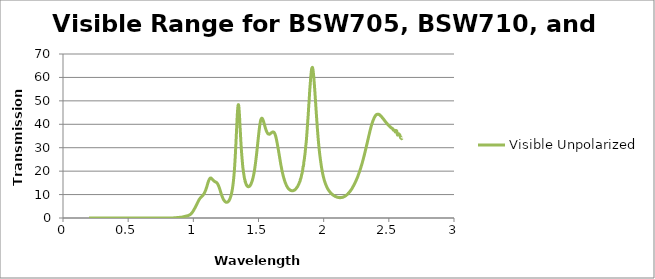
| Category | Visible Unpolarized |
|---|---|
| 2.6 | 34.013 |
| 2.599 | 33.856 |
| 2.598 | 33.845 |
| 2.597 | 33.947 |
| 2.596 | 34.112 |
| 2.595 | 34.271 |
| 2.594 | 34.298 |
| 2.593 | 34.209 |
| 2.592 | 34.2 |
| 2.591 | 34.19 |
| 2.59 | 34.294 |
| 2.589 | 34.55 |
| 2.588 | 34.658 |
| 2.587 | 34.901 |
| 2.586 | 34.983 |
| 2.585 | 35.222 |
| 2.584 | 35.471 |
| 2.583 | 35.563 |
| 2.582 | 35.593 |
| 2.581 | 35.642 |
| 2.58 | 35.603 |
| 2.579 | 35.631 |
| 2.578 | 35.732 |
| 2.577 | 35.877 |
| 2.576 | 35.919 |
| 2.575 | 35.952 |
| 2.574 | 35.89 |
| 2.573 | 35.794 |
| 2.572 | 35.579 |
| 2.571 | 35.519 |
| 2.57 | 35.51 |
| 2.569 | 35.515 |
| 2.568 | 35.427 |
| 2.567 | 35.389 |
| 2.566 | 35.509 |
| 2.565 | 35.752 |
| 2.564 | 36.041 |
| 2.563 | 36.354 |
| 2.562 | 36.685 |
| 2.561 | 36.947 |
| 2.56 | 37.202 |
| 2.559 | 37.271 |
| 2.558 | 37.256 |
| 2.557 | 37.293 |
| 2.556 | 37.348 |
| 2.555 | 37.297 |
| 2.554 | 37.2 |
| 2.553 | 37.091 |
| 2.552 | 36.963 |
| 2.551 | 36.851 |
| 2.55 | 36.791 |
| 2.549 | 36.749 |
| 2.548 | 36.877 |
| 2.547 | 36.999 |
| 2.546 | 37.054 |
| 2.545 | 37.213 |
| 2.544 | 37.394 |
| 2.543 | 37.445 |
| 2.542 | 37.495 |
| 2.541 | 37.545 |
| 2.54 | 37.578 |
| 2.539 | 37.589 |
| 2.538 | 37.508 |
| 2.537 | 37.49 |
| 2.536 | 37.508 |
| 2.535 | 37.51 |
| 2.534 | 37.591 |
| 2.533 | 37.734 |
| 2.532 | 37.81 |
| 2.531 | 37.87 |
| 2.53 | 37.92 |
| 2.529 | 38.031 |
| 2.528 | 38.173 |
| 2.527 | 38.24 |
| 2.526 | 38.301 |
| 2.525 | 38.323 |
| 2.524 | 38.364 |
| 2.523 | 38.359 |
| 2.522 | 38.406 |
| 2.521 | 38.4 |
| 2.52 | 38.395 |
| 2.519 | 38.429 |
| 2.518 | 38.526 |
| 2.517 | 38.569 |
| 2.516 | 38.602 |
| 2.515 | 38.636 |
| 2.514 | 38.68 |
| 2.513 | 38.787 |
| 2.512 | 38.91 |
| 2.511 | 38.933 |
| 2.51 | 38.922 |
| 2.509 | 38.941 |
| 2.508 | 39.011 |
| 2.507 | 39.055 |
| 2.506 | 39.085 |
| 2.505 | 39.149 |
| 2.504 | 39.259 |
| 2.503 | 39.318 |
| 2.502 | 39.349 |
| 2.501 | 39.409 |
| 2.5 | 39.512 |
| 2.499 | 39.539 |
| 2.498 | 39.551 |
| 2.497 | 39.578 |
| 2.496 | 39.652 |
| 2.495 | 39.774 |
| 2.494 | 39.827 |
| 2.493 | 39.868 |
| 2.492 | 39.916 |
| 2.491 | 39.963 |
| 2.49 | 40.009 |
| 2.489 | 40.066 |
| 2.488 | 40.146 |
| 2.487 | 40.262 |
| 2.486 | 40.308 |
| 2.485 | 40.347 |
| 2.484 | 40.408 |
| 2.483 | 40.461 |
| 2.482 | 40.536 |
| 2.481 | 40.661 |
| 2.48 | 40.718 |
| 2.479 | 40.79 |
| 2.478 | 40.904 |
| 2.477 | 40.939 |
| 2.476 | 40.974 |
| 2.475 | 41.014 |
| 2.474 | 41.076 |
| 2.473 | 41.14 |
| 2.472 | 41.208 |
| 2.471 | 41.283 |
| 2.47 | 41.376 |
| 2.469 | 41.501 |
| 2.468 | 41.561 |
| 2.467 | 41.603 |
| 2.466 | 41.644 |
| 2.465 | 41.73 |
| 2.464 | 41.846 |
| 2.463 | 41.908 |
| 2.462 | 41.992 |
| 2.461 | 42.047 |
| 2.46 | 42.086 |
| 2.459 | 42.185 |
| 2.458 | 42.302 |
| 2.457 | 42.359 |
| 2.456 | 42.402 |
| 2.455 | 42.457 |
| 2.454 | 42.52 |
| 2.453 | 42.581 |
| 2.452 | 42.658 |
| 2.451 | 42.727 |
| 2.45 | 42.789 |
| 2.449 | 42.875 |
| 2.448 | 42.993 |
| 2.447 | 43.068 |
| 2.446 | 43.127 |
| 2.445 | 43.172 |
| 2.444 | 43.222 |
| 2.443 | 43.301 |
| 2.442 | 43.399 |
| 2.441 | 43.443 |
| 2.44 | 43.491 |
| 2.439 | 43.519 |
| 2.438 | 43.549 |
| 2.437 | 43.604 |
| 2.436 | 43.658 |
| 2.435 | 43.714 |
| 2.434 | 43.805 |
| 2.433 | 43.894 |
| 2.432 | 43.932 |
| 2.431 | 43.965 |
| 2.43 | 43.994 |
| 2.429 | 44.06 |
| 2.428 | 44.13 |
| 2.427 | 44.156 |
| 2.426 | 44.172 |
| 2.425 | 44.178 |
| 2.424 | 44.187 |
| 2.423 | 44.199 |
| 2.422 | 44.241 |
| 2.421 | 44.291 |
| 2.42 | 44.297 |
| 2.419 | 44.296 |
| 2.418 | 44.299 |
| 2.417 | 44.287 |
| 2.416 | 44.279 |
| 2.415 | 44.273 |
| 2.414 | 44.257 |
| 2.413 | 44.285 |
| 2.412 | 44.306 |
| 2.411 | 44.276 |
| 2.41 | 44.238 |
| 2.409 | 44.191 |
| 2.408 | 44.153 |
| 2.407 | 44.172 |
| 2.406 | 44.182 |
| 2.405 | 44.137 |
| 2.404 | 44.081 |
| 2.403 | 44.016 |
| 2.402 | 43.952 |
| 2.401 | 43.885 |
| 2.4 | 43.813 |
| 2.399 | 43.78 |
| 2.398 | 43.752 |
| 2.397 | 43.672 |
| 2.396 | 43.575 |
| 2.395 | 43.482 |
| 2.394 | 43.39 |
| 2.393 | 43.297 |
| 2.392 | 43.196 |
| 2.391 | 43.077 |
| 2.39 | 43.002 |
| 2.389 | 42.934 |
| 2.388 | 42.824 |
| 2.387 | 42.691 |
| 2.386 | 42.548 |
| 2.385 | 42.412 |
| 2.384 | 42.278 |
| 2.383 | 42.138 |
| 2.382 | 41.99 |
| 2.381 | 41.876 |
| 2.38 | 41.764 |
| 2.379 | 41.611 |
| 2.378 | 41.446 |
| 2.377 | 41.284 |
| 2.376 | 41.122 |
| 2.375 | 40.941 |
| 2.374 | 40.769 |
| 2.373 | 40.635 |
| 2.372 | 40.49 |
| 2.371 | 40.316 |
| 2.37 | 40.135 |
| 2.369 | 39.948 |
| 2.368 | 39.752 |
| 2.367 | 39.545 |
| 2.366 | 39.354 |
| 2.365 | 39.201 |
| 2.364 | 39.019 |
| 2.363 | 38.795 |
| 2.362 | 38.58 |
| 2.361 | 38.362 |
| 2.36 | 38.128 |
| 2.359 | 37.906 |
| 2.358 | 37.68 |
| 2.357 | 37.502 |
| 2.356 | 37.304 |
| 2.355 | 37.064 |
| 2.354 | 36.828 |
| 2.353 | 36.595 |
| 2.352 | 36.355 |
| 2.351 | 36.11 |
| 2.35 | 35.864 |
| 2.349 | 35.615 |
| 2.348 | 35.407 |
| 2.347 | 35.192 |
| 2.346 | 34.952 |
| 2.345 | 34.711 |
| 2.344 | 34.468 |
| 2.343 | 34.206 |
| 2.342 | 33.956 |
| 2.341 | 33.702 |
| 2.34 | 33.494 |
| 2.339 | 33.28 |
| 2.338 | 33.032 |
| 2.337 | 32.777 |
| 2.336 | 32.541 |
| 2.335 | 32.287 |
| 2.334 | 32.041 |
| 2.333 | 31.799 |
| 2.332 | 31.603 |
| 2.331 | 31.39 |
| 2.33 | 31.147 |
| 2.329 | 30.893 |
| 2.328 | 30.654 |
| 2.327 | 30.409 |
| 2.326 | 30.156 |
| 2.325 | 29.912 |
| 2.324 | 29.713 |
| 2.323 | 29.497 |
| 2.322 | 29.255 |
| 2.321 | 29.008 |
| 2.32 | 28.761 |
| 2.319 | 28.513 |
| 2.318 | 28.273 |
| 2.317 | 28.032 |
| 2.316 | 27.845 |
| 2.315 | 27.644 |
| 2.314 | 27.406 |
| 2.313 | 27.162 |
| 2.312 | 26.935 |
| 2.311 | 26.7 |
| 2.31 | 26.471 |
| 2.309 | 26.239 |
| 2.308 | 26.058 |
| 2.307 | 25.853 |
| 2.306 | 25.632 |
| 2.305 | 25.403 |
| 2.304 | 25.184 |
| 2.303 | 24.959 |
| 2.302 | 24.742 |
| 2.301 | 24.524 |
| 2.3 | 24.367 |
| 2.299 | 24.188 |
| 2.298 | 23.971 |
| 2.297 | 23.759 |
| 2.296 | 23.553 |
| 2.295 | 23.36 |
| 2.294 | 23.16 |
| 2.293 | 22.973 |
| 2.292 | 22.765 |
| 2.291 | 22.626 |
| 2.29 | 22.461 |
| 2.289 | 22.269 |
| 2.288 | 22.072 |
| 2.287 | 21.882 |
| 2.286 | 21.681 |
| 2.285 | 21.507 |
| 2.284 | 21.325 |
| 2.283 | 21.149 |
| 2.282 | 20.962 |
| 2.281 | 20.832 |
| 2.28 | 20.674 |
| 2.279 | 20.492 |
| 2.278 | 20.315 |
| 2.277 | 20.133 |
| 2.276 | 19.959 |
| 2.275 | 19.777 |
| 2.274 | 19.604 |
| 2.273 | 19.434 |
| 2.272 | 19.273 |
| 2.271 | 19.103 |
| 2.27 | 18.994 |
| 2.269 | 18.852 |
| 2.268 | 18.7 |
| 2.267 | 18.523 |
| 2.266 | 18.36 |
| 2.265 | 18.203 |
| 2.264 | 18.043 |
| 2.263 | 17.881 |
| 2.262 | 17.745 |
| 2.261 | 17.601 |
| 2.26 | 17.447 |
| 2.259 | 17.312 |
| 2.258 | 17.166 |
| 2.257 | 17.078 |
| 2.256 | 16.964 |
| 2.255 | 16.82 |
| 2.254 | 16.686 |
| 2.253 | 16.542 |
| 2.252 | 16.406 |
| 2.251 | 16.276 |
| 2.25 | 16.14 |
| 2.249 | 16.006 |
| 2.248 | 15.88 |
| 2.247 | 15.753 |
| 2.246 | 15.672 |
| 2.245 | 15.569 |
| 2.244 | 15.431 |
| 2.243 | 15.299 |
| 2.242 | 15.172 |
| 2.241 | 15.049 |
| 2.24 | 14.917 |
| 2.239 | 14.8 |
| 2.238 | 14.728 |
| 2.237 | 14.637 |
| 2.236 | 14.498 |
| 2.235 | 14.377 |
| 2.234 | 14.269 |
| 2.233 | 14.144 |
| 2.232 | 14.022 |
| 2.231 | 13.911 |
| 2.23 | 13.796 |
| 2.229 | 13.689 |
| 2.228 | 13.642 |
| 2.227 | 13.561 |
| 2.226 | 13.435 |
| 2.225 | 13.349 |
| 2.224 | 13.246 |
| 2.223 | 13.126 |
| 2.222 | 13.022 |
| 2.221 | 12.921 |
| 2.22 | 12.817 |
| 2.219 | 12.721 |
| 2.218 | 12.637 |
| 2.217 | 12.551 |
| 2.216 | 12.457 |
| 2.215 | 12.376 |
| 2.214 | 12.285 |
| 2.213 | 12.185 |
| 2.212 | 12.096 |
| 2.211 | 12.073 |
| 2.21 | 12.008 |
| 2.209 | 11.902 |
| 2.208 | 11.804 |
| 2.207 | 11.705 |
| 2.206 | 11.667 |
| 2.205 | 11.59 |
| 2.204 | 11.485 |
| 2.203 | 11.438 |
| 2.202 | 11.364 |
| 2.201 | 11.256 |
| 2.2 | 11.218 |
| 2.199 | 11.165 |
| 2.198 | 11.079 |
| 2.197 | 10.995 |
| 2.196 | 10.924 |
| 2.195 | 10.897 |
| 2.194 | 10.826 |
| 2.193 | 10.725 |
| 2.192 | 10.691 |
| 2.191 | 10.635 |
| 2.19 | 10.602 |
| 2.189 | 10.541 |
| 2.188 | 10.448 |
| 2.187 | 10.366 |
| 2.186 | 10.297 |
| 2.185 | 10.278 |
| 2.184 | 10.229 |
| 2.183 | 10.16 |
| 2.182 | 10.098 |
| 2.181 | 10.075 |
| 2.18 | 10.017 |
| 2.179 | 9.954 |
| 2.178 | 9.89 |
| 2.177 | 9.875 |
| 2.176 | 9.832 |
| 2.175 | 9.773 |
| 2.174 | 9.72 |
| 2.173 | 9.667 |
| 2.172 | 9.654 |
| 2.171 | 9.619 |
| 2.17 | 9.562 |
| 2.169 | 9.505 |
| 2.168 | 9.468 |
| 2.167 | 9.459 |
| 2.166 | 9.421 |
| 2.165 | 9.372 |
| 2.164 | 9.331 |
| 2.163 | 9.278 |
| 2.162 | 9.245 |
| 2.161 | 9.245 |
| 2.16 | 9.227 |
| 2.159 | 9.177 |
| 2.158 | 9.137 |
| 2.157 | 9.13 |
| 2.156 | 9.108 |
| 2.155 | 9.062 |
| 2.154 | 9.017 |
| 2.153 | 8.988 |
| 2.152 | 9.004 |
| 2.151 | 8.985 |
| 2.15 | 8.936 |
| 2.149 | 8.902 |
| 2.148 | 8.877 |
| 2.147 | 8.89 |
| 2.146 | 8.87 |
| 2.145 | 8.838 |
| 2.144 | 8.82 |
| 2.143 | 8.832 |
| 2.142 | 8.816 |
| 2.141 | 8.785 |
| 2.14 | 8.766 |
| 2.139 | 8.777 |
| 2.138 | 8.765 |
| 2.137 | 8.741 |
| 2.136 | 8.721 |
| 2.135 | 8.708 |
| 2.134 | 8.73 |
| 2.133 | 8.722 |
| 2.132 | 8.705 |
| 2.131 | 8.691 |
| 2.13 | 8.715 |
| 2.129 | 8.719 |
| 2.128 | 8.703 |
| 2.127 | 8.676 |
| 2.126 | 8.678 |
| 2.125 | 8.708 |
| 2.124 | 8.714 |
| 2.123 | 8.698 |
| 2.122 | 8.683 |
| 2.121 | 8.688 |
| 2.12 | 8.726 |
| 2.119 | 8.728 |
| 2.118 | 8.715 |
| 2.117 | 8.72 |
| 2.116 | 8.756 |
| 2.115 | 8.764 |
| 2.114 | 8.75 |
| 2.113 | 8.744 |
| 2.112 | 8.755 |
| 2.111 | 8.802 |
| 2.11 | 8.809 |
| 2.109 | 8.809 |
| 2.108 | 8.811 |
| 2.107 | 8.821 |
| 2.106 | 8.872 |
| 2.105 | 8.885 |
| 2.104 | 8.887 |
| 2.103 | 8.891 |
| 2.102 | 8.896 |
| 2.101 | 8.918 |
| 2.1 | 8.975 |
| 2.099 | 8.995 |
| 2.098 | 8.998 |
| 2.097 | 9.007 |
| 2.096 | 9.037 |
| 2.095 | 9.087 |
| 2.094 | 9.106 |
| 2.093 | 9.113 |
| 2.092 | 9.122 |
| 2.091 | 9.151 |
| 2.09 | 9.208 |
| 2.089 | 9.231 |
| 2.088 | 9.251 |
| 2.087 | 9.26 |
| 2.086 | 9.301 |
| 2.085 | 9.36 |
| 2.084 | 9.383 |
| 2.083 | 9.399 |
| 2.082 | 9.424 |
| 2.081 | 9.46 |
| 2.08 | 9.512 |
| 2.079 | 9.553 |
| 2.078 | 9.57 |
| 2.077 | 9.594 |
| 2.076 | 9.623 |
| 2.075 | 9.67 |
| 2.074 | 9.737 |
| 2.073 | 9.78 |
| 2.072 | 9.811 |
| 2.071 | 9.844 |
| 2.07 | 9.901 |
| 2.069 | 9.966 |
| 2.068 | 10.01 |
| 2.067 | 10.037 |
| 2.066 | 10.061 |
| 2.065 | 10.121 |
| 2.064 | 10.202 |
| 2.063 | 10.249 |
| 2.062 | 10.284 |
| 2.061 | 10.327 |
| 2.06 | 10.365 |
| 2.059 | 10.433 |
| 2.058 | 10.511 |
| 2.057 | 10.565 |
| 2.056 | 10.608 |
| 2.055 | 10.654 |
| 2.054 | 10.728 |
| 2.053 | 10.807 |
| 2.052 | 10.86 |
| 2.051 | 10.907 |
| 2.05 | 10.954 |
| 2.049 | 11.031 |
| 2.048 | 11.119 |
| 2.047 | 11.172 |
| 2.046 | 11.226 |
| 2.045 | 11.312 |
| 2.044 | 11.409 |
| 2.043 | 11.475 |
| 2.042 | 11.531 |
| 2.041 | 11.595 |
| 2.04 | 11.686 |
| 2.039 | 11.788 |
| 2.038 | 11.865 |
| 2.037 | 11.937 |
| 2.036 | 12.037 |
| 2.035 | 12.141 |
| 2.034 | 12.223 |
| 2.033 | 12.302 |
| 2.032 | 12.383 |
| 2.031 | 12.496 |
| 2.03 | 12.618 |
| 2.029 | 12.714 |
| 2.028 | 12.808 |
| 2.027 | 12.932 |
| 2.026 | 13.062 |
| 2.025 | 13.164 |
| 2.024 | 13.268 |
| 2.023 | 13.375 |
| 2.022 | 13.512 |
| 2.021 | 13.657 |
| 2.02 | 13.778 |
| 2.019 | 13.895 |
| 2.018 | 14.016 |
| 2.017 | 14.168 |
| 2.016 | 14.323 |
| 2.015 | 14.459 |
| 2.014 | 14.593 |
| 2.013 | 14.754 |
| 2.012 | 14.918 |
| 2.011 | 15.07 |
| 2.01 | 15.218 |
| 2.009 | 15.368 |
| 2.008 | 15.553 |
| 2.007 | 15.745 |
| 2.006 | 15.924 |
| 2.005 | 16.1 |
| 2.004 | 16.28 |
| 2.003 | 16.465 |
| 2.002 | 16.691 |
| 2.001 | 16.915 |
| 2.0 | 17.115 |
| 1.999 | 17.32 |
| 1.998 | 17.542 |
| 1.997 | 17.811 |
| 1.996 | 18.07 |
| 1.995 | 18.3 |
| 1.994 | 18.535 |
| 1.993 | 18.793 |
| 1.992 | 19.053 |
| 1.991 | 19.327 |
| 1.99 | 19.655 |
| 1.989 | 19.968 |
| 1.988 | 20.264 |
| 1.987 | 20.566 |
| 1.986 | 20.878 |
| 1.985 | 21.196 |
| 1.984 | 21.523 |
| 1.983 | 21.857 |
| 1.982 | 22.22 |
| 1.981 | 22.582 |
| 1.98 | 22.958 |
| 1.979 | 23.338 |
| 1.978 | 23.725 |
| 1.977 | 24.109 |
| 1.976 | 24.509 |
| 1.975 | 24.925 |
| 1.974 | 25.357 |
| 1.973 | 25.784 |
| 1.972 | 26.199 |
| 1.971 | 26.644 |
| 1.97 | 27.133 |
| 1.969 | 27.61 |
| 1.968 | 28.095 |
| 1.967 | 28.603 |
| 1.966 | 29.145 |
| 1.965 | 29.693 |
| 1.964 | 30.247 |
| 1.963 | 30.781 |
| 1.962 | 31.344 |
| 1.961 | 31.942 |
| 1.96 | 32.562 |
| 1.959 | 33.202 |
| 1.958 | 33.844 |
| 1.957 | 34.47 |
| 1.956 | 35.175 |
| 1.955 | 35.89 |
| 1.954 | 36.586 |
| 1.953 | 37.291 |
| 1.952 | 38.023 |
| 1.951 | 38.777 |
| 1.95 | 39.52 |
| 1.949 | 40.307 |
| 1.948 | 41.1 |
| 1.947 | 41.867 |
| 1.946 | 42.696 |
| 1.945 | 43.531 |
| 1.944 | 44.328 |
| 1.943 | 45.13 |
| 1.942 | 46.013 |
| 1.941 | 46.838 |
| 1.94 | 47.681 |
| 1.939 | 48.561 |
| 1.938 | 49.416 |
| 1.937 | 50.258 |
| 1.936 | 51.067 |
| 1.935 | 51.875 |
| 1.934 | 52.731 |
| 1.933 | 53.586 |
| 1.932 | 54.4 |
| 1.931 | 55.176 |
| 1.93 | 55.944 |
| 1.929 | 56.719 |
| 1.928 | 57.46 |
| 1.927 | 58.161 |
| 1.926 | 58.868 |
| 1.925 | 59.572 |
| 1.924 | 60.196 |
| 1.923 | 60.793 |
| 1.922 | 61.377 |
| 1.921 | 61.922 |
| 1.92 | 62.44 |
| 1.919 | 62.863 |
| 1.918 | 63.276 |
| 1.917 | 63.633 |
| 1.916 | 63.898 |
| 1.915 | 64.061 |
| 1.914 | 64.257 |
| 1.913 | 64.294 |
| 1.912 | 64.199 |
| 1.911 | 64.099 |
| 1.91 | 64.001 |
| 1.909 | 63.876 |
| 1.908 | 63.775 |
| 1.907 | 63.492 |
| 1.906 | 63.016 |
| 1.905 | 62.419 |
| 1.904 | 61.827 |
| 1.903 | 61.32 |
| 1.902 | 60.805 |
| 1.901 | 60.24 |
| 1.9 | 59.593 |
| 1.899 | 58.846 |
| 1.898 | 58.019 |
| 1.897 | 57.259 |
| 1.896 | 56.541 |
| 1.895 | 55.909 |
| 1.894 | 55.158 |
| 1.893 | 54.4 |
| 1.892 | 53.464 |
| 1.891 | 52.463 |
| 1.89 | 51.5 |
| 1.889 | 50.616 |
| 1.888 | 49.769 |
| 1.887 | 49.03 |
| 1.886 | 48.284 |
| 1.885 | 47.436 |
| 1.884 | 46.464 |
| 1.883 | 45.5 |
| 1.882 | 44.591 |
| 1.881 | 43.741 |
| 1.88 | 42.969 |
| 1.879 | 42.219 |
| 1.878 | 41.505 |
| 1.877 | 40.688 |
| 1.876 | 39.835 |
| 1.875 | 38.953 |
| 1.874 | 38.185 |
| 1.873 | 37.398 |
| 1.872 | 36.547 |
| 1.871 | 35.842 |
| 1.87 | 35.12 |
| 1.869 | 34.365 |
| 1.868 | 33.582 |
| 1.867 | 32.95 |
| 1.866 | 32.364 |
| 1.865 | 31.863 |
| 1.864 | 31.378 |
| 1.863 | 30.917 |
| 1.862 | 30.402 |
| 1.861 | 29.794 |
| 1.86 | 29.157 |
| 1.859 | 28.501 |
| 1.858 | 27.962 |
| 1.857 | 27.47 |
| 1.856 | 27.043 |
| 1.855 | 26.677 |
| 1.854 | 26.228 |
| 1.853 | 25.734 |
| 1.852 | 25.219 |
| 1.851 | 24.764 |
| 1.85 | 24.491 |
| 1.849 | 24.297 |
| 1.848 | 23.911 |
| 1.847 | 23.266 |
| 1.846 | 22.617 |
| 1.845 | 22.21 |
| 1.844 | 22.074 |
| 1.843 | 21.997 |
| 1.842 | 21.894 |
| 1.841 | 21.492 |
| 1.84 | 20.902 |
| 1.839 | 20.445 |
| 1.838 | 20.118 |
| 1.837 | 19.894 |
| 1.836 | 19.606 |
| 1.835 | 19.265 |
| 1.834 | 18.979 |
| 1.833 | 18.776 |
| 1.832 | 18.672 |
| 1.831 | 18.531 |
| 1.83 | 18.268 |
| 1.829 | 17.908 |
| 1.828 | 17.635 |
| 1.827 | 17.382 |
| 1.826 | 17.147 |
| 1.825 | 16.912 |
| 1.824 | 16.759 |
| 1.823 | 16.693 |
| 1.822 | 16.645 |
| 1.821 | 16.445 |
| 1.82 | 16.069 |
| 1.819 | 15.699 |
| 1.818 | 15.532 |
| 1.817 | 15.484 |
| 1.816 | 15.433 |
| 1.815 | 15.372 |
| 1.814 | 15.198 |
| 1.813 | 15.021 |
| 1.812 | 14.854 |
| 1.811 | 14.699 |
| 1.81 | 14.54 |
| 1.809 | 14.416 |
| 1.808 | 14.343 |
| 1.807 | 14.288 |
| 1.806 | 14.192 |
| 1.805 | 14.049 |
| 1.804 | 13.89 |
| 1.803 | 13.759 |
| 1.802 | 13.651 |
| 1.801 | 13.563 |
| 1.8 | 13.46 |
| 1.799 | 13.335 |
| 1.798 | 13.244 |
| 1.797 | 13.209 |
| 1.796 | 13.189 |
| 1.795 | 13.118 |
| 1.794 | 13.007 |
| 1.793 | 12.919 |
| 1.792 | 12.829 |
| 1.791 | 12.748 |
| 1.79 | 12.677 |
| 1.789 | 12.609 |
| 1.788 | 12.545 |
| 1.787 | 12.495 |
| 1.786 | 12.439 |
| 1.785 | 12.36 |
| 1.784 | 12.308 |
| 1.783 | 12.26 |
| 1.782 | 12.194 |
| 1.781 | 12.155 |
| 1.78 | 12.112 |
| 1.779 | 12.047 |
| 1.778 | 11.975 |
| 1.777 | 11.951 |
| 1.776 | 11.929 |
| 1.775 | 11.895 |
| 1.774 | 11.859 |
| 1.773 | 11.825 |
| 1.772 | 11.798 |
| 1.771 | 11.776 |
| 1.77 | 11.752 |
| 1.769 | 11.73 |
| 1.768 | 11.711 |
| 1.767 | 11.691 |
| 1.766 | 11.678 |
| 1.765 | 11.67 |
| 1.764 | 11.647 |
| 1.763 | 11.632 |
| 1.762 | 11.62 |
| 1.761 | 11.618 |
| 1.76 | 11.608 |
| 1.759 | 11.608 |
| 1.758 | 11.605 |
| 1.757 | 11.619 |
| 1.756 | 11.636 |
| 1.755 | 11.676 |
| 1.754 | 11.69 |
| 1.753 | 11.694 |
| 1.752 | 11.701 |
| 1.751 | 11.71 |
| 1.75 | 11.726 |
| 1.749 | 11.733 |
| 1.748 | 11.748 |
| 1.747 | 11.768 |
| 1.746 | 11.799 |
| 1.745 | 11.825 |
| 1.744 | 11.853 |
| 1.743 | 11.886 |
| 1.742 | 11.919 |
| 1.741 | 11.944 |
| 1.74 | 11.984 |
| 1.739 | 12.038 |
| 1.738 | 12.124 |
| 1.737 | 12.177 |
| 1.736 | 12.21 |
| 1.735 | 12.252 |
| 1.734 | 12.302 |
| 1.733 | 12.35 |
| 1.732 | 12.402 |
| 1.731 | 12.463 |
| 1.73 | 12.524 |
| 1.729 | 12.589 |
| 1.728 | 12.649 |
| 1.727 | 12.722 |
| 1.726 | 12.791 |
| 1.725 | 12.868 |
| 1.724 | 12.945 |
| 1.723 | 13.045 |
| 1.722 | 13.167 |
| 1.721 | 13.26 |
| 1.72 | 13.339 |
| 1.719 | 13.43 |
| 1.718 | 13.519 |
| 1.717 | 13.618 |
| 1.716 | 13.73 |
| 1.715 | 13.833 |
| 1.714 | 13.948 |
| 1.713 | 14.067 |
| 1.712 | 14.193 |
| 1.711 | 14.315 |
| 1.71 | 14.467 |
| 1.709 | 14.633 |
| 1.708 | 14.772 |
| 1.707 | 14.903 |
| 1.706 | 15.033 |
| 1.705 | 15.176 |
| 1.704 | 15.334 |
| 1.703 | 15.491 |
| 1.702 | 15.65 |
| 1.701 | 15.808 |
| 1.7 | 15.968 |
| 1.699 | 16.143 |
| 1.698 | 16.338 |
| 1.697 | 16.548 |
| 1.696 | 16.738 |
| 1.695 | 16.92 |
| 1.694 | 17.102 |
| 1.693 | 17.286 |
| 1.692 | 17.484 |
| 1.691 | 17.688 |
| 1.69 | 17.893 |
| 1.689 | 18.103 |
| 1.688 | 18.35 |
| 1.687 | 18.606 |
| 1.686 | 18.824 |
| 1.685 | 19.056 |
| 1.684 | 19.294 |
| 1.683 | 19.531 |
| 1.682 | 19.774 |
| 1.681 | 20.027 |
| 1.68 | 20.302 |
| 1.679 | 20.575 |
| 1.678 | 20.869 |
| 1.677 | 21.185 |
| 1.676 | 21.474 |
| 1.675 | 21.756 |
| 1.674 | 22.047 |
| 1.673 | 22.336 |
| 1.672 | 22.63 |
| 1.671 | 22.938 |
| 1.67 | 23.245 |
| 1.669 | 23.589 |
| 1.668 | 23.938 |
| 1.667 | 24.236 |
| 1.666 | 24.546 |
| 1.665 | 24.874 |
| 1.664 | 25.206 |
| 1.663 | 25.555 |
| 1.662 | 25.897 |
| 1.661 | 26.255 |
| 1.66 | 26.618 |
| 1.659 | 26.949 |
| 1.658 | 27.272 |
| 1.657 | 27.591 |
| 1.656 | 27.912 |
| 1.655 | 28.235 |
| 1.654 | 28.558 |
| 1.653 | 28.883 |
| 1.652 | 29.202 |
| 1.651 | 29.546 |
| 1.65 | 29.886 |
| 1.649 | 30.201 |
| 1.648 | 30.513 |
| 1.647 | 30.822 |
| 1.646 | 31.124 |
| 1.645 | 31.422 |
| 1.644 | 31.748 |
| 1.643 | 32.06 |
| 1.642 | 32.335 |
| 1.641 | 32.609 |
| 1.64 | 32.876 |
| 1.639 | 33.148 |
| 1.638 | 33.438 |
| 1.637 | 33.716 |
| 1.636 | 33.962 |
| 1.635 | 34.19 |
| 1.634 | 34.413 |
| 1.633 | 34.622 |
| 1.632 | 34.852 |
| 1.631 | 35.065 |
| 1.63 | 35.24 |
| 1.629 | 35.406 |
| 1.628 | 35.559 |
| 1.627 | 35.705 |
| 1.626 | 35.846 |
| 1.625 | 35.977 |
| 1.624 | 36.096 |
| 1.623 | 36.233 |
| 1.622 | 36.355 |
| 1.621 | 36.429 |
| 1.62 | 36.492 |
| 1.619 | 36.553 |
| 1.618 | 36.611 |
| 1.617 | 36.648 |
| 1.616 | 36.675 |
| 1.615 | 36.705 |
| 1.614 | 36.731 |
| 1.613 | 36.741 |
| 1.612 | 36.742 |
| 1.611 | 36.739 |
| 1.61 | 36.728 |
| 1.609 | 36.722 |
| 1.608 | 36.703 |
| 1.607 | 36.677 |
| 1.606 | 36.645 |
| 1.605 | 36.609 |
| 1.604 | 36.568 |
| 1.603 | 36.528 |
| 1.602 | 36.488 |
| 1.601 | 36.44 |
| 1.6 | 36.398 |
| 1.599 | 36.348 |
| 1.598 | 36.328 |
| 1.597 | 36.292 |
| 1.596 | 36.235 |
| 1.595 | 36.174 |
| 1.594 | 36.128 |
| 1.593 | 36.079 |
| 1.592 | 36.018 |
| 1.591 | 35.965 |
| 1.59 | 35.924 |
| 1.589 | 35.883 |
| 1.588 | 35.852 |
| 1.587 | 35.83 |
| 1.586 | 35.808 |
| 1.585 | 35.795 |
| 1.584 | 35.764 |
| 1.583 | 35.764 |
| 1.582 | 35.779 |
| 1.581 | 35.797 |
| 1.58 | 35.802 |
| 1.579 | 35.807 |
| 1.578 | 35.814 |
| 1.577 | 35.825 |
| 1.576 | 35.856 |
| 1.575 | 35.881 |
| 1.574 | 35.936 |
| 1.573 | 36.011 |
| 1.572 | 36.059 |
| 1.571 | 36.104 |
| 1.57 | 36.156 |
| 1.569 | 36.222 |
| 1.568 | 36.332 |
| 1.567 | 36.43 |
| 1.566 | 36.509 |
| 1.565 | 36.613 |
| 1.564 | 36.721 |
| 1.563 | 36.846 |
| 1.562 | 36.975 |
| 1.561 | 37.107 |
| 1.56 | 37.234 |
| 1.559 | 37.374 |
| 1.558 | 37.511 |
| 1.557 | 37.685 |
| 1.556 | 37.868 |
| 1.555 | 38.04 |
| 1.554 | 38.207 |
| 1.553 | 38.372 |
| 1.552 | 38.549 |
| 1.551 | 38.74 |
| 1.55 | 38.951 |
| 1.549 | 39.166 |
| 1.548 | 39.365 |
| 1.547 | 39.557 |
| 1.546 | 39.754 |
| 1.545 | 39.962 |
| 1.544 | 40.155 |
| 1.543 | 40.353 |
| 1.542 | 40.543 |
| 1.541 | 40.724 |
| 1.54 | 40.922 |
| 1.539 | 41.126 |
| 1.538 | 41.317 |
| 1.537 | 41.486 |
| 1.536 | 41.628 |
| 1.535 | 41.781 |
| 1.534 | 41.921 |
| 1.533 | 42.048 |
| 1.532 | 42.165 |
| 1.531 | 42.266 |
| 1.53 | 42.36 |
| 1.529 | 42.441 |
| 1.528 | 42.488 |
| 1.527 | 42.562 |
| 1.526 | 42.6 |
| 1.525 | 42.603 |
| 1.524 | 42.564 |
| 1.523 | 42.519 |
| 1.522 | 42.451 |
| 1.521 | 42.356 |
| 1.52 | 42.233 |
| 1.519 | 42.126 |
| 1.518 | 41.964 |
| 1.517 | 41.775 |
| 1.516 | 41.538 |
| 1.515 | 41.271 |
| 1.514 | 41.002 |
| 1.513 | 40.7 |
| 1.512 | 40.386 |
| 1.511 | 40.055 |
| 1.51 | 39.693 |
| 1.509 | 39.282 |
| 1.508 | 38.869 |
| 1.507 | 38.407 |
| 1.506 | 37.966 |
| 1.505 | 37.524 |
| 1.504 | 37.037 |
| 1.503 | 36.522 |
| 1.502 | 36.026 |
| 1.501 | 35.519 |
| 1.5 | 35.005 |
| 1.499 | 34.488 |
| 1.498 | 33.991 |
| 1.497 | 33.433 |
| 1.496 | 32.9 |
| 1.495 | 32.362 |
| 1.494 | 31.841 |
| 1.493 | 31.282 |
| 1.492 | 30.777 |
| 1.491 | 30.235 |
| 1.49 | 29.724 |
| 1.489 | 29.185 |
| 1.488 | 28.673 |
| 1.487 | 28.162 |
| 1.486 | 27.659 |
| 1.485 | 27.148 |
| 1.484 | 26.661 |
| 1.483 | 26.156 |
| 1.482 | 25.721 |
| 1.481 | 25.288 |
| 1.48 | 24.829 |
| 1.479 | 24.354 |
| 1.478 | 23.91 |
| 1.477 | 23.47 |
| 1.476 | 23.043 |
| 1.475 | 22.603 |
| 1.474 | 22.185 |
| 1.473 | 21.796 |
| 1.472 | 21.453 |
| 1.471 | 21.066 |
| 1.47 | 20.642 |
| 1.469 | 20.265 |
| 1.468 | 19.925 |
| 1.467 | 19.615 |
| 1.466 | 19.334 |
| 1.465 | 19.03 |
| 1.464 | 18.728 |
| 1.463 | 18.46 |
| 1.462 | 18.21 |
| 1.461 | 17.939 |
| 1.46 | 17.67 |
| 1.459 | 17.404 |
| 1.458 | 17.154 |
| 1.457 | 16.953 |
| 1.456 | 16.768 |
| 1.455 | 16.542 |
| 1.454 | 16.335 |
| 1.453 | 16.123 |
| 1.452 | 15.94 |
| 1.451 | 15.781 |
| 1.45 | 15.615 |
| 1.449 | 15.409 |
| 1.448 | 15.249 |
| 1.447 | 15.176 |
| 1.446 | 15.057 |
| 1.445 | 14.87 |
| 1.444 | 14.701 |
| 1.443 | 14.539 |
| 1.442 | 14.415 |
| 1.441 | 14.351 |
| 1.44 | 14.26 |
| 1.439 | 14.154 |
| 1.438 | 14.056 |
| 1.437 | 13.958 |
| 1.436 | 13.866 |
| 1.435 | 13.774 |
| 1.434 | 13.719 |
| 1.433 | 13.665 |
| 1.432 | 13.616 |
| 1.431 | 13.55 |
| 1.43 | 13.481 |
| 1.429 | 13.437 |
| 1.428 | 13.459 |
| 1.427 | 13.44 |
| 1.426 | 13.398 |
| 1.425 | 13.379 |
| 1.424 | 13.395 |
| 1.423 | 13.387 |
| 1.422 | 13.369 |
| 1.421 | 13.372 |
| 1.42 | 13.417 |
| 1.419 | 13.481 |
| 1.418 | 13.436 |
| 1.417 | 13.416 |
| 1.416 | 13.452 |
| 1.415 | 13.609 |
| 1.414 | 13.716 |
| 1.413 | 13.671 |
| 1.412 | 13.677 |
| 1.411 | 13.785 |
| 1.41 | 13.985 |
| 1.409 | 14.133 |
| 1.408 | 14.142 |
| 1.407 | 14.143 |
| 1.406 | 14.238 |
| 1.405 | 14.393 |
| 1.404 | 14.54 |
| 1.403 | 14.637 |
| 1.402 | 14.863 |
| 1.401 | 15.242 |
| 1.4 | 15.461 |
| 1.399 | 15.382 |
| 1.398 | 15.381 |
| 1.397 | 15.691 |
| 1.396 | 16.203 |
| 1.395 | 16.47 |
| 1.394 | 16.483 |
| 1.393 | 16.662 |
| 1.392 | 17.014 |
| 1.391 | 17.315 |
| 1.39 | 17.626 |
| 1.389 | 18.076 |
| 1.388 | 18.492 |
| 1.387 | 18.789 |
| 1.386 | 19.061 |
| 1.385 | 19.471 |
| 1.384 | 19.942 |
| 1.383 | 20.422 |
| 1.382 | 20.82 |
| 1.381 | 21.154 |
| 1.38 | 21.559 |
| 1.379 | 22.091 |
| 1.378 | 22.733 |
| 1.377 | 23.424 |
| 1.376 | 24.07 |
| 1.375 | 24.708 |
| 1.374 | 25.301 |
| 1.373 | 25.95 |
| 1.372 | 26.676 |
| 1.371 | 27.42 |
| 1.37 | 28.122 |
| 1.369 | 28.843 |
| 1.368 | 29.668 |
| 1.367 | 30.583 |
| 1.366 | 31.43 |
| 1.365 | 32.335 |
| 1.364 | 33.384 |
| 1.363 | 34.362 |
| 1.362 | 35.375 |
| 1.361 | 36.532 |
| 1.36 | 37.49 |
| 1.359 | 38.443 |
| 1.358 | 39.555 |
| 1.357 | 40.749 |
| 1.356 | 41.862 |
| 1.355 | 42.928 |
| 1.354 | 43.86 |
| 1.353 | 44.693 |
| 1.352 | 45.514 |
| 1.351 | 46.307 |
| 1.35 | 46.997 |
| 1.349 | 47.566 |
| 1.348 | 47.993 |
| 1.347 | 48.239 |
| 1.346 | 48.361 |
| 1.345 | 48.386 |
| 1.344 | 48.274 |
| 1.343 | 47.974 |
| 1.342 | 47.516 |
| 1.341 | 46.929 |
| 1.34 | 46.243 |
| 1.339 | 45.486 |
| 1.338 | 44.634 |
| 1.337 | 43.642 |
| 1.336 | 42.612 |
| 1.335 | 41.514 |
| 1.334 | 40.382 |
| 1.333 | 39.215 |
| 1.332 | 38.011 |
| 1.331 | 36.79 |
| 1.33 | 35.616 |
| 1.329 | 34.458 |
| 1.328 | 33.27 |
| 1.327 | 32.08 |
| 1.326 | 30.928 |
| 1.325 | 29.822 |
| 1.324 | 28.74 |
| 1.323 | 27.668 |
| 1.322 | 26.65 |
| 1.321 | 25.65 |
| 1.32 | 24.683 |
| 1.319 | 23.758 |
| 1.318 | 22.862 |
| 1.317 | 21.999 |
| 1.316 | 21.204 |
| 1.315 | 20.432 |
| 1.314 | 19.694 |
| 1.313 | 18.997 |
| 1.312 | 18.323 |
| 1.311 | 17.687 |
| 1.31 | 17.099 |
| 1.309 | 16.536 |
| 1.308 | 15.989 |
| 1.307 | 15.46 |
| 1.306 | 14.963 |
| 1.305 | 14.511 |
| 1.304 | 14.081 |
| 1.303 | 13.643 |
| 1.302 | 13.227 |
| 1.301 | 12.849 |
| 1.3 | 12.488 |
| 1.299 | 12.155 |
| 1.298 | 11.86 |
| 1.297 | 11.565 |
| 1.296 | 11.273 |
| 1.295 | 10.993 |
| 1.294 | 10.723 |
| 1.293 | 10.471 |
| 1.292 | 10.231 |
| 1.291 | 10.008 |
| 1.29 | 9.8 |
| 1.289 | 9.598 |
| 1.288 | 9.407 |
| 1.287 | 9.226 |
| 1.286 | 9.049 |
| 1.285 | 8.878 |
| 1.284 | 8.695 |
| 1.283 | 8.521 |
| 1.282 | 8.376 |
| 1.281 | 8.242 |
| 1.28 | 8.118 |
| 1.279 | 8.004 |
| 1.278 | 7.896 |
| 1.277 | 7.787 |
| 1.276 | 7.655 |
| 1.275 | 7.529 |
| 1.274 | 7.438 |
| 1.273 | 7.355 |
| 1.272 | 7.275 |
| 1.271 | 7.204 |
| 1.27 | 7.138 |
| 1.269 | 7.073 |
| 1.268 | 7.03 |
| 1.267 | 7.005 |
| 1.266 | 6.952 |
| 1.265 | 6.896 |
| 1.264 | 6.846 |
| 1.263 | 6.796 |
| 1.262 | 6.782 |
| 1.261 | 6.777 |
| 1.26 | 6.754 |
| 1.259 | 6.752 |
| 1.258 | 6.759 |
| 1.257 | 6.753 |
| 1.256 | 6.729 |
| 1.255 | 6.713 |
| 1.254 | 6.713 |
| 1.253 | 6.715 |
| 1.252 | 6.726 |
| 1.251 | 6.76 |
| 1.25 | 6.795 |
| 1.249 | 6.816 |
| 1.248 | 6.84 |
| 1.247 | 6.876 |
| 1.246 | 6.921 |
| 1.245 | 6.963 |
| 1.244 | 7.004 |
| 1.243 | 7.057 |
| 1.242 | 7.114 |
| 1.241 | 7.181 |
| 1.24 | 7.243 |
| 1.239 | 7.299 |
| 1.238 | 7.361 |
| 1.237 | 7.438 |
| 1.236 | 7.518 |
| 1.235 | 7.584 |
| 1.234 | 7.653 |
| 1.233 | 7.738 |
| 1.232 | 7.836 |
| 1.231 | 7.938 |
| 1.23 | 8.044 |
| 1.229 | 8.163 |
| 1.228 | 8.281 |
| 1.227 | 8.399 |
| 1.226 | 8.514 |
| 1.225 | 8.661 |
| 1.224 | 8.804 |
| 1.223 | 8.929 |
| 1.222 | 9.058 |
| 1.221 | 9.221 |
| 1.22 | 9.375 |
| 1.219 | 9.522 |
| 1.218 | 9.666 |
| 1.217 | 9.843 |
| 1.216 | 10.018 |
| 1.215 | 10.18 |
| 1.214 | 10.333 |
| 1.213 | 10.5 |
| 1.212 | 10.668 |
| 1.211 | 10.84 |
| 1.21 | 11.021 |
| 1.209 | 11.197 |
| 1.208 | 11.374 |
| 1.207 | 11.558 |
| 1.206 | 11.744 |
| 1.205 | 11.91 |
| 1.204 | 12.071 |
| 1.203 | 12.236 |
| 1.202 | 12.413 |
| 1.201 | 12.603 |
| 1.2 | 12.763 |
| 1.199 | 12.914 |
| 1.198 | 13.087 |
| 1.197 | 13.255 |
| 1.196 | 13.396 |
| 1.195 | 13.526 |
| 1.194 | 13.669 |
| 1.193 | 13.808 |
| 1.192 | 13.939 |
| 1.191 | 14.066 |
| 1.19 | 14.185 |
| 1.189 | 14.32 |
| 1.188 | 14.438 |
| 1.187 | 14.52 |
| 1.186 | 14.596 |
| 1.185 | 14.676 |
| 1.184 | 14.763 |
| 1.183 | 14.848 |
| 1.182 | 14.927 |
| 1.181 | 14.994 |
| 1.18 | 15.048 |
| 1.179 | 15.1 |
| 1.178 | 15.153 |
| 1.177 | 15.197 |
| 1.176 | 15.226 |
| 1.175 | 15.274 |
| 1.174 | 15.3 |
| 1.173 | 15.332 |
| 1.172 | 15.367 |
| 1.171 | 15.396 |
| 1.17 | 15.427 |
| 1.169 | 15.457 |
| 1.168 | 15.493 |
| 1.167 | 15.471 |
| 1.166 | 15.483 |
| 1.165 | 15.527 |
| 1.164 | 15.577 |
| 1.163 | 15.614 |
| 1.162 | 15.656 |
| 1.161 | 15.701 |
| 1.16 | 15.746 |
| 1.159 | 15.8 |
| 1.158 | 15.851 |
| 1.157 | 15.898 |
| 1.156 | 15.956 |
| 1.155 | 16.014 |
| 1.154 | 16.068 |
| 1.153 | 16.135 |
| 1.152 | 16.202 |
| 1.151 | 16.256 |
| 1.15 | 16.29 |
| 1.149 | 16.348 |
| 1.148 | 16.405 |
| 1.147 | 16.474 |
| 1.146 | 16.542 |
| 1.145 | 16.604 |
| 1.144 | 16.631 |
| 1.143 | 16.67 |
| 1.142 | 16.72 |
| 1.141 | 16.785 |
| 1.14 | 16.829 |
| 1.139 | 16.877 |
| 1.138 | 16.919 |
| 1.137 | 16.968 |
| 1.136 | 17.016 |
| 1.135 | 17.064 |
| 1.134 | 17.042 |
| 1.133 | 16.955 |
| 1.132 | 16.905 |
| 1.131 | 16.943 |
| 1.13 | 17.017 |
| 1.129 | 17.011 |
| 1.128 | 16.977 |
| 1.127 | 16.879 |
| 1.126 | 16.808 |
| 1.125 | 16.744 |
| 1.124 | 16.615 |
| 1.123 | 16.527 |
| 1.122 | 16.429 |
| 1.121 | 16.328 |
| 1.12 | 16.203 |
| 1.119 | 16.073 |
| 1.118 | 15.937 |
| 1.117 | 15.796 |
| 1.116 | 15.639 |
| 1.115 | 15.485 |
| 1.114 | 15.317 |
| 1.113 | 15.147 |
| 1.112 | 14.97 |
| 1.111 | 14.806 |
| 1.11 | 14.614 |
| 1.109 | 14.443 |
| 1.108 | 14.26 |
| 1.107 | 14.076 |
| 1.106 | 13.884 |
| 1.105 | 13.652 |
| 1.104 | 13.454 |
| 1.103 | 13.293 |
| 1.102 | 13.123 |
| 1.101 | 12.966 |
| 1.1 | 12.791 |
| 1.099 | 12.644 |
| 1.098 | 12.485 |
| 1.097 | 12.326 |
| 1.096 | 12.173 |
| 1.095 | 11.976 |
| 1.094 | 11.826 |
| 1.093 | 11.685 |
| 1.092 | 11.551 |
| 1.091 | 11.433 |
| 1.09 | 11.301 |
| 1.089 | 11.181 |
| 1.088 | 11.035 |
| 1.087 | 10.915 |
| 1.086 | 10.809 |
| 1.085 | 10.715 |
| 1.084 | 10.562 |
| 1.083 | 10.461 |
| 1.082 | 10.373 |
| 1.081 | 10.287 |
| 1.08 | 10.208 |
| 1.079 | 10.124 |
| 1.078 | 10.051 |
| 1.077 | 9.977 |
| 1.076 | 9.85 |
| 1.075 | 9.784 |
| 1.074 | 9.712 |
| 1.073 | 9.671 |
| 1.072 | 9.604 |
| 1.071 | 9.54 |
| 1.07 | 9.492 |
| 1.069 | 9.389 |
| 1.068 | 9.331 |
| 1.067 | 9.28 |
| 1.066 | 9.237 |
| 1.065 | 9.195 |
| 1.064 | 9.148 |
| 1.063 | 9.104 |
| 1.062 | 9.055 |
| 1.061 | 8.995 |
| 1.06 | 8.908 |
| 1.059 | 8.847 |
| 1.058 | 8.804 |
| 1.057 | 8.753 |
| 1.056 | 8.711 |
| 1.055 | 8.659 |
| 1.054 | 8.591 |
| 1.053 | 8.489 |
| 1.052 | 8.423 |
| 1.051 | 8.362 |
| 1.05 | 8.297 |
| 1.049 | 8.233 |
| 1.048 | 8.157 |
| 1.047 | 8.071 |
| 1.046 | 7.954 |
| 1.045 | 7.867 |
| 1.044 | 7.778 |
| 1.043 | 7.698 |
| 1.042 | 7.609 |
| 1.041 | 7.51 |
| 1.04 | 7.377 |
| 1.039 | 7.266 |
| 1.038 | 7.172 |
| 1.037 | 7.076 |
| 1.036 | 6.959 |
| 1.035 | 6.813 |
| 1.034 | 6.704 |
| 1.033 | 6.601 |
| 1.032 | 6.505 |
| 1.031 | 6.4 |
| 1.03 | 6.28 |
| 1.029 | 6.126 |
| 1.028 | 6.007 |
| 1.027 | 5.905 |
| 1.026 | 5.81 |
| 1.025 | 5.707 |
| 1.024 | 5.588 |
| 1.023 | 5.438 |
| 1.022 | 5.328 |
| 1.021 | 5.224 |
| 1.02 | 5.129 |
| 1.019 | 5.029 |
| 1.018 | 4.918 |
| 1.017 | 4.783 |
| 1.016 | 4.682 |
| 1.015 | 4.592 |
| 1.014 | 4.503 |
| 1.013 | 4.389 |
| 1.012 | 4.251 |
| 1.011 | 4.152 |
| 1.01 | 4.062 |
| 1.009 | 3.981 |
| 1.008 | 3.875 |
| 1.007 | 3.751 |
| 1.006 | 3.655 |
| 1.005 | 3.576 |
| 1.004 | 3.475 |
| 1.003 | 3.34 |
| 1.002 | 3.254 |
| 1.001 | 3.176 |
| 1.0 | 3.1 |
| 0.999 | 3.001 |
| 0.998 | 2.88 |
| 0.997 | 2.804 |
| 0.996 | 2.73 |
| 0.995 | 2.66 |
| 0.994 | 2.577 |
| 0.993 | 2.465 |
| 0.992 | 2.396 |
| 0.991 | 2.319 |
| 0.99 | 2.222 |
| 0.989 | 2.165 |
| 0.988 | 2.113 |
| 0.987 | 2.065 |
| 0.986 | 2.002 |
| 0.985 | 1.917 |
| 0.984 | 1.86 |
| 0.983 | 1.812 |
| 0.982 | 1.723 |
| 0.981 | 1.679 |
| 0.98 | 1.652 |
| 0.979 | 1.601 |
| 0.978 | 1.532 |
| 0.977 | 1.497 |
| 0.976 | 1.473 |
| 0.975 | 1.434 |
| 0.974 | 1.379 |
| 0.973 | 1.356 |
| 0.972 | 1.338 |
| 0.971 | 1.292 |
| 0.97 | 1.263 |
| 0.969 | 1.241 |
| 0.968 | 1.2 |
| 0.967 | 1.188 |
| 0.966 | 1.169 |
| 0.965 | 1.13 |
| 0.964 | 1.119 |
| 0.963 | 1.104 |
| 0.962 | 1.067 |
| 0.961 | 1.061 |
| 0.96 | 1.043 |
| 0.959 | 0.991 |
| 0.958 | 0.955 |
| 0.957 | 0.96 |
| 0.956 | 0.973 |
| 0.955 | 0.968 |
| 0.954 | 0.925 |
| 0.953 | 0.89 |
| 0.952 | 0.899 |
| 0.951 | 0.904 |
| 0.95 | 0.882 |
| 0.949 | 0.873 |
| 0.948 | 0.843 |
| 0.947 | 0.805 |
| 0.946 | 0.801 |
| 0.945 | 0.818 |
| 0.944 | 0.801 |
| 0.943 | 0.772 |
| 0.942 | 0.767 |
| 0.941 | 0.758 |
| 0.94 | 0.743 |
| 0.939 | 0.739 |
| 0.938 | 0.715 |
| 0.937 | 0.705 |
| 0.936 | 0.7 |
| 0.935 | 0.675 |
| 0.934 | 0.654 |
| 0.933 | 0.656 |
| 0.932 | 0.644 |
| 0.931 | 0.607 |
| 0.93 | 0.582 |
| 0.929 | 0.591 |
| 0.928 | 0.596 |
| 0.927 | 0.568 |
| 0.926 | 0.537 |
| 0.925 | 0.53 |
| 0.924 | 0.533 |
| 0.923 | 0.54 |
| 0.922 | 0.522 |
| 0.921 | 0.474 |
| 0.92 | 0.451 |
| 0.919 | 0.451 |
| 0.918 | 0.442 |
| 0.917 | 0.445 |
| 0.916 | 0.44 |
| 0.915 | 0.413 |
| 0.914 | 0.396 |
| 0.913 | 0.39 |
| 0.912 | 0.373 |
| 0.911 | 0.35 |
| 0.91 | 0.352 |
| 0.909 | 0.361 |
| 0.908 | 0.343 |
| 0.907 | 0.315 |
| 0.906 | 0.315 |
| 0.905 | 0.325 |
| 0.904 | 0.307 |
| 0.903 | 0.29 |
| 0.902 | 0.302 |
| 0.901 | 0.317 |
| 0.9 | 0.3 |
| 0.899 | 0.271 |
| 0.898 | 0.249 |
| 0.897 | 0.254 |
| 0.896 | 0.279 |
| 0.895 | 0.278 |
| 0.894 | 0.262 |
| 0.893 | 0.243 |
| 0.892 | 0.223 |
| 0.891 | 0.213 |
| 0.89 | 0.233 |
| 0.889 | 0.254 |
| 0.888 | 0.255 |
| 0.887 | 0.228 |
| 0.886 | 0.197 |
| 0.885 | 0.176 |
| 0.884 | 0.183 |
| 0.883 | 0.208 |
| 0.882 | 0.21 |
| 0.881 | 0.199 |
| 0.88 | 0.183 |
| 0.879 | 0.158 |
| 0.878 | 0.16 |
| 0.877 | 0.175 |
| 0.876 | 0.165 |
| 0.875 | 0.157 |
| 0.874 | 0.164 |
| 0.873 | 0.166 |
| 0.872 | 0.139 |
| 0.871 | 0.105 |
| 0.87 | 0.087 |
| 0.869 | 0.11 |
| 0.868 | 0.139 |
| 0.867 | 0.142 |
| 0.866 | 0.124 |
| 0.865 | 0.101 |
| 0.864 | 0.081 |
| 0.863 | 0.063 |
| 0.862 | 0.06 |
| 0.861 | 0.079 |
| 0.86 | 0.079 |
| 0.859 | 0.074 |
| 0.858 | 0.073 |
| 0.857 | 0.07 |
| 0.856 | 0.068 |
| 0.855 | 0.067 |
| 0.854 | 0.065 |
| 0.853 | 0.062 |
| 0.852 | 0.058 |
| 0.851 | 0.056 |
| 0.85 | 0.056 |
| 0.849 | 0.055 |
| 0.848 | 0.055 |
| 0.847 | 0.052 |
| 0.846 | 0.05 |
| 0.845 | 0.049 |
| 0.844 | 0.048 |
| 0.843 | 0.045 |
| 0.842 | 0.046 |
| 0.841 | 0.044 |
| 0.84 | 0.041 |
| 0.839 | 0.041 |
| 0.838 | 0.039 |
| 0.837 | 0.04 |
| 0.836 | 0.04 |
| 0.835 | 0.037 |
| 0.834 | 0.035 |
| 0.833 | 0.033 |
| 0.832 | 0.033 |
| 0.831 | 0.032 |
| 0.83 | 0.032 |
| 0.829 | 0.03 |
| 0.828 | 0.029 |
| 0.827 | 0.027 |
| 0.826 | 0.027 |
| 0.825 | 0.026 |
| 0.824 | 0.027 |
| 0.823 | 0.023 |
| 0.822 | 0.021 |
| 0.821 | 0.021 |
| 0.82 | 0.02 |
| 0.819 | 0.02 |
| 0.818 | 0.02 |
| 0.817 | 0.018 |
| 0.816 | 0.016 |
| 0.815 | 0.016 |
| 0.814 | 0.014 |
| 0.813 | 0.014 |
| 0.812 | 0.015 |
| 0.811 | 0.012 |
| 0.81 | 0.011 |
| 0.809 | 0.009 |
| 0.808 | 0.01 |
| 0.807 | 0.009 |
| 0.806 | 0.01 |
| 0.805 | 0.008 |
| 0.804 | 0.01 |
| 0.803 | 0.008 |
| 0.802 | 0.008 |
| 0.801 | 0.006 |
| 0.8 | 0.007 |
| 0.799 | 0.006 |
| 0.798 | 0.007 |
| 0.797 | 0.007 |
| 0.796 | 0.006 |
| 0.795 | 0.004 |
| 0.794 | 0.006 |
| 0.793 | 0.003 |
| 0.792 | 0.004 |
| 0.791 | 0.004 |
| 0.79 | 0.005 |
| 0.789 | 0.002 |
| 0.788 | 0.001 |
| 0.787 | 0.002 |
| 0.786 | 0.004 |
| 0.785 | 0.003 |
| 0.784 | 0.003 |
| 0.783 | 0.001 |
| 0.782 | 0.002 |
| 0.781 | 0.001 |
| 0.78 | 0.002 |
| 0.779 | 0.002 |
| 0.778 | 0.002 |
| 0.777 | 0 |
| 0.776 | 0.001 |
| 0.775 | 0 |
| 0.774 | 0.001 |
| 0.773 | 0.002 |
| 0.772 | 0 |
| 0.771 | 0.001 |
| 0.77 | 0.002 |
| 0.769 | 0 |
| 0.768 | 0.001 |
| 0.767 | 0.002 |
| 0.766 | 0.001 |
| 0.765 | 0.002 |
| 0.764 | 0.001 |
| 0.763 | 0.002 |
| 0.762 | 0 |
| 0.761 | 0 |
| 0.76 | 0.001 |
| 0.759 | 0.002 |
| 0.758 | 0 |
| 0.757 | 0.001 |
| 0.756 | 0 |
| 0.755 | 0.002 |
| 0.754 | 0.003 |
| 0.753 | 0.003 |
| 0.752 | 0.002 |
| 0.751 | 0.002 |
| 0.75 | 0.001 |
| 0.749 | 0.001 |
| 0.748 | 0.003 |
| 0.747 | 0.003 |
| 0.746 | 0.003 |
| 0.745 | 0.003 |
| 0.744 | 0 |
| 0.743 | 0.001 |
| 0.742 | 0.004 |
| 0.741 | 0.003 |
| 0.74 | 0.002 |
| 0.739 | 0.003 |
| 0.738 | 0.002 |
| 0.737 | 0.001 |
| 0.736 | 0.003 |
| 0.735 | 0.005 |
| 0.734 | 0.002 |
| 0.733 | 0.004 |
| 0.732 | 0.001 |
| 0.731 | 0.001 |
| 0.73 | 0.004 |
| 0.729 | 0.004 |
| 0.728 | 0.004 |
| 0.727 | 0.003 |
| 0.726 | 0.001 |
| 0.725 | 0 |
| 0.724 | 0.003 |
| 0.723 | 0.005 |
| 0.722 | 0.001 |
| 0.721 | 0.005 |
| 0.72 | 0.001 |
| 0.719 | 0 |
| 0.718 | 0.006 |
| 0.717 | 0.006 |
| 0.716 | 0.003 |
| 0.715 | 0.004 |
| 0.714 | 0.001 |
| 0.713 | 0.001 |
| 0.712 | 0.003 |
| 0.711 | 0.005 |
| 0.71 | 0 |
| 0.709 | 0.005 |
| 0.708 | 0 |
| 0.707 | 0.001 |
| 0.706 | 0.004 |
| 0.705 | 0.005 |
| 0.704 | 0.001 |
| 0.703 | 0.005 |
| 0.702 | 0 |
| 0.701 | 0.002 |
| 0.7 | 0.004 |
| 0.699 | 0.006 |
| 0.698 | 0.001 |
| 0.697 | 0.005 |
| 0.696 | 0 |
| 0.695 | 0.002 |
| 0.694 | 0.005 |
| 0.693 | 0.006 |
| 0.692 | 0 |
| 0.691 | 0.004 |
| 0.69 | 0 |
| 0.689 | 0.005 |
| 0.688 | 0.004 |
| 0.687 | 0.004 |
| 0.686 | 0.001 |
| 0.685 | 0.004 |
| 0.684 | 0.001 |
| 0.683 | 0.001 |
| 0.682 | 0.005 |
| 0.681 | 0.004 |
| 0.68 | 0.004 |
| 0.679 | 0.004 |
| 0.678 | 0 |
| 0.677 | 0.002 |
| 0.676 | 0.004 |
| 0.675 | 0.006 |
| 0.674 | 0.001 |
| 0.673 | 0.005 |
| 0.672 | 0 |
| 0.671 | 0.001 |
| 0.67 | 0.005 |
| 0.669 | 0.005 |
| 0.668 | 0.001 |
| 0.667 | 0.004 |
| 0.666 | 0 |
| 0.665 | 0.002 |
| 0.664 | 0.004 |
| 0.663 | 0.006 |
| 0.662 | 0.001 |
| 0.661 | 0.004 |
| 0.66 | 0 |
| 0.659 | 0.002 |
| 0.658 | 0.004 |
| 0.657 | 0.004 |
| 0.656 | 0.004 |
| 0.655 | 0.004 |
| 0.654 | 0.001 |
| 0.653 | 0.002 |
| 0.652 | 0.004 |
| 0.651 | 0.005 |
| 0.65 | 0.002 |
| 0.649 | 0.005 |
| 0.648 | 0.002 |
| 0.647 | 0.003 |
| 0.646 | 0.006 |
| 0.645 | 0.005 |
| 0.644 | 0.003 |
| 0.643 | 0.005 |
| 0.642 | 0.001 |
| 0.641 | 0.002 |
| 0.64 | 0.005 |
| 0.639 | 0.005 |
| 0.638 | 0.002 |
| 0.637 | 0.004 |
| 0.636 | 0.001 |
| 0.635 | 0.002 |
| 0.634 | 0.005 |
| 0.633 | 0.005 |
| 0.632 | 0.002 |
| 0.631 | 0.005 |
| 0.63 | 0.002 |
| 0.629 | 0.002 |
| 0.628 | 0.005 |
| 0.627 | 0.004 |
| 0.626 | 0.002 |
| 0.625 | 0.004 |
| 0.624 | 0.002 |
| 0.623 | 0.002 |
| 0.622 | 0.005 |
| 0.621 | 0.004 |
| 0.62 | 0.003 |
| 0.619 | 0.004 |
| 0.618 | 0.002 |
| 0.617 | 0.003 |
| 0.616 | 0.005 |
| 0.615 | 0.004 |
| 0.614 | 0.005 |
| 0.613 | 0.004 |
| 0.612 | 0.003 |
| 0.611 | 0.002 |
| 0.61 | 0.006 |
| 0.609 | 0.004 |
| 0.608 | 0.004 |
| 0.607 | 0.004 |
| 0.606 | 0.002 |
| 0.605 | 0.003 |
| 0.604 | 0.005 |
| 0.603 | 0.004 |
| 0.602 | 0.004 |
| 0.601 | 0.004 |
| 0.6 | 0.002 |
| 0.599 | 0.002 |
| 0.598 | 0.006 |
| 0.597 | 0.004 |
| 0.596 | 0.003 |
| 0.595 | 0.004 |
| 0.594 | 0.002 |
| 0.593 | 0.003 |
| 0.592 | 0.005 |
| 0.591 | 0.004 |
| 0.59 | 0.006 |
| 0.589 | 0.005 |
| 0.588 | 0.003 |
| 0.587 | 0.003 |
| 0.586 | 0.006 |
| 0.585 | 0.004 |
| 0.584 | 0.003 |
| 0.583 | 0.005 |
| 0.582 | 0.004 |
| 0.581 | 0.003 |
| 0.58 | 0.005 |
| 0.579 | 0.004 |
| 0.578 | 0.003 |
| 0.577 | 0.004 |
| 0.576 | 0.002 |
| 0.575 | 0.003 |
| 0.574 | 0.005 |
| 0.573 | 0.004 |
| 0.572 | 0.004 |
| 0.571 | 0.004 |
| 0.57 | 0.001 |
| 0.569 | 0.003 |
| 0.568 | 0.005 |
| 0.567 | 0.004 |
| 0.566 | 0.004 |
| 0.565 | 0.004 |
| 0.564 | 0.002 |
| 0.563 | 0.004 |
| 0.562 | 0.005 |
| 0.561 | 0.005 |
| 0.56 | 0.006 |
| 0.559 | 0.004 |
| 0.558 | 0.003 |
| 0.557 | 0.003 |
| 0.556 | 0.002 |
| 0.555 | 0.004 |
| 0.554 | 0.006 |
| 0.553 | 0.005 |
| 0.552 | 0.005 |
| 0.551 | 0.003 |
| 0.55 | 0.003 |
| 0.549 | 0.005 |
| 0.548 | 0.006 |
| 0.547 | 0.005 |
| 0.546 | 0.004 |
| 0.545 | 0.004 |
| 0.544 | 0.002 |
| 0.543 | 0.004 |
| 0.542 | 0.006 |
| 0.541 | 0.005 |
| 0.54 | 0.005 |
| 0.539 | 0.004 |
| 0.538 | 0.002 |
| 0.537 | 0.004 |
| 0.536 | 0.006 |
| 0.535 | 0.005 |
| 0.534 | 0.005 |
| 0.533 | 0.004 |
| 0.532 | 0.002 |
| 0.531 | 0.004 |
| 0.53 | 0.006 |
| 0.529 | 0.004 |
| 0.528 | 0.004 |
| 0.527 | 0.004 |
| 0.526 | 0.002 |
| 0.525 | 0.004 |
| 0.524 | 0.006 |
| 0.523 | 0.004 |
| 0.522 | 0.004 |
| 0.521 | 0.004 |
| 0.52 | 0.002 |
| 0.519 | 0.004 |
| 0.518 | 0.006 |
| 0.517 | 0.004 |
| 0.516 | 0.004 |
| 0.515 | 0.004 |
| 0.514 | 0.002 |
| 0.513 | 0.004 |
| 0.512 | 0.006 |
| 0.511 | 0.004 |
| 0.51 | 0.004 |
| 0.509 | 0.004 |
| 0.508 | 0.002 |
| 0.507 | 0.004 |
| 0.506 | 0.006 |
| 0.505 | 0.004 |
| 0.504 | 0.004 |
| 0.503 | 0.004 |
| 0.502 | 0.002 |
| 0.501 | 0.004 |
| 0.5 | 0.006 |
| 0.499 | 0.004 |
| 0.498 | 0.004 |
| 0.497 | 0.003 |
| 0.496 | 0.002 |
| 0.495 | 0.004 |
| 0.494 | 0.006 |
| 0.493 | 0.004 |
| 0.492 | 0.004 |
| 0.491 | 0.003 |
| 0.49 | 0.002 |
| 0.489 | 0.004 |
| 0.488 | 0.005 |
| 0.487 | 0.003 |
| 0.486 | 0.004 |
| 0.485 | 0.003 |
| 0.484 | 0.002 |
| 0.483 | 0.004 |
| 0.482 | 0.006 |
| 0.481 | 0.003 |
| 0.48 | 0.004 |
| 0.479 | 0.004 |
| 0.478 | 0.002 |
| 0.477 | 0.004 |
| 0.476 | 0.006 |
| 0.475 | 0.003 |
| 0.474 | 0.004 |
| 0.473 | 0.004 |
| 0.472 | 0.002 |
| 0.471 | 0.005 |
| 0.47 | 0.005 |
| 0.469 | 0.004 |
| 0.468 | 0.004 |
| 0.467 | 0.004 |
| 0.466 | 0.002 |
| 0.465 | 0.005 |
| 0.464 | 0.006 |
| 0.463 | 0.004 |
| 0.462 | 0.005 |
| 0.461 | 0.004 |
| 0.46 | 0.001 |
| 0.459 | 0.005 |
| 0.458 | 0.005 |
| 0.457 | 0.003 |
| 0.456 | 0.004 |
| 0.455 | 0.003 |
| 0.454 | 0.001 |
| 0.453 | 0.004 |
| 0.452 | 0.005 |
| 0.451 | 0.004 |
| 0.45 | 0.005 |
| 0.449 | 0.004 |
| 0.448 | 0.002 |
| 0.447 | 0.005 |
| 0.446 | 0.005 |
| 0.445 | 0.003 |
| 0.444 | 0.004 |
| 0.443 | 0.004 |
| 0.442 | 0.002 |
| 0.441 | 0.004 |
| 0.44 | 0.005 |
| 0.439 | 0.003 |
| 0.438 | 0.005 |
| 0.437 | 0.003 |
| 0.436 | 0.002 |
| 0.435 | 0.005 |
| 0.434 | 0.006 |
| 0.433 | 0.003 |
| 0.432 | 0.005 |
| 0.431 | 0.003 |
| 0.43 | 0.002 |
| 0.429 | 0.005 |
| 0.428 | 0.004 |
| 0.427 | 0.002 |
| 0.426 | 0.005 |
| 0.425 | 0.002 |
| 0.424 | 0.002 |
| 0.423 | 0.004 |
| 0.422 | 0.003 |
| 0.421 | 0.004 |
| 0.42 | 0.007 |
| 0.419 | 0.002 |
| 0.418 | 0.002 |
| 0.417 | 0.004 |
| 0.416 | 0.006 |
| 0.415 | 0.002 |
| 0.414 | 0.005 |
| 0.413 | 0.002 |
| 0.412 | 0.002 |
| 0.411 | 0.003 |
| 0.41 | 0.005 |
| 0.409 | 0.002 |
| 0.408 | 0.005 |
| 0.407 | 0.002 |
| 0.406 | 0.002 |
| 0.405 | 0.004 |
| 0.404 | 0.006 |
| 0.403 | 0.003 |
| 0.402 | 0.005 |
| 0.401 | 0.002 |
| 0.4 | 0.003 |
| 0.399 | 0.005 |
| 0.398 | 0.006 |
| 0.397 | 0.003 |
| 0.396 | 0.005 |
| 0.395 | 0.002 |
| 0.394 | 0.002 |
| 0.393 | 0.004 |
| 0.392 | 0.006 |
| 0.391 | 0.006 |
| 0.39 | 0.007 |
| 0.389 | 0.002 |
| 0.388 | 0.002 |
| 0.387 | 0.004 |
| 0.386 | 0.005 |
| 0.385 | 0.002 |
| 0.384 | 0.006 |
| 0.383 | 0.002 |
| 0.382 | 0.002 |
| 0.381 | 0.004 |
| 0.38 | 0.006 |
| 0.379 | 0.006 |
| 0.378 | 0.007 |
| 0.377 | 0.002 |
| 0.376 | 0.004 |
| 0.375 | 0.001 |
| 0.374 | 0.004 |
| 0.373 | 0.001 |
| 0.372 | 0.002 |
| 0.371 | 0.004 |
| 0.37 | 0.004 |
| 0.369 | 0.003 |
| 0.368 | 0.006 |
| 0.367 | 0.001 |
| 0.366 | 0.002 |
| 0.365 | 0.003 |
| 0.364 | 0.006 |
| 0.363 | 0.003 |
| 0.362 | 0.006 |
| 0.361 | 0.002 |
| 0.36 | 0.002 |
| 0.359 | 0.005 |
| 0.358 | 0.005 |
| 0.357 | 0.004 |
| 0.356 | 0.005 |
| 0.355 | 0.002 |
| 0.354 | 0.002 |
| 0.353 | 0.005 |
| 0.352 | 0.006 |
| 0.351 | 0.006 |
| 0.35 | 0.005 |
| 0.349 | 0.001 |
| 0.348 | 0.001 |
| 0.347 | 0.005 |
| 0.346 | 0.004 |
| 0.345 | 0.002 |
| 0.344 | 0.004 |
| 0.343 | 0.002 |
| 0.342 | 0.002 |
| 0.341 | 0.004 |
| 0.34 | 0.005 |
| 0.339 | 0.004 |
| 0.338 | 0.005 |
| 0.337 | 0.002 |
| 0.336 | 0.001 |
| 0.335 | 0.006 |
| 0.334 | 0.006 |
| 0.333 | 0.002 |
| 0.332 | 0.006 |
| 0.331 | 0.002 |
| 0.33 | 0.001 |
| 0.329 | 0.006 |
| 0.328 | 0.004 |
| 0.327 | 0.003 |
| 0.326 | 0.006 |
| 0.325 | 0.002 |
| 0.324 | 0 |
| 0.323 | 0.004 |
| 0.322 | 0.005 |
| 0.321 | 0.007 |
| 0.32 | 0.002 |
| 0.319 | 0.007 |
| 0.318 | 0.006 |
| 0.317 | 0.006 |
| 0.316 | 0.007 |
| 0.315 | 0.001 |
| 0.314 | 0.005 |
| 0.313 | 0 |
| 0.312 | 0.001 |
| 0.311 | 0.004 |
| 0.31 | 0.004 |
| 0.309 | 0.004 |
| 0.308 | 0.007 |
| 0.307 | 0.001 |
| 0.306 | 0.003 |
| 0.305 | 0.004 |
| 0.304 | 0.006 |
| 0.303 | 0.003 |
| 0.302 | 0.005 |
| 0.301 | 0.001 |
| 0.3 | 0.002 |
| 0.299 | 0.005 |
| 0.298 | 0.005 |
| 0.297 | 0.001 |
| 0.296 | 0.005 |
| 0.295 | 0 |
| 0.294 | 0.003 |
| 0.293 | 0.005 |
| 0.292 | 0.006 |
| 0.291 | 0.004 |
| 0.29 | 0.003 |
| 0.289 | 0.002 |
| 0.288 | 0.002 |
| 0.287 | 0.006 |
| 0.286 | 0.005 |
| 0.285 | 0.004 |
| 0.284 | 0.005 |
| 0.283 | 0 |
| 0.282 | 0.003 |
| 0.281 | 0.006 |
| 0.28 | 0.005 |
| 0.279 | 0.002 |
| 0.278 | 0.005 |
| 0.277 | 0.002 |
| 0.276 | 0.002 |
| 0.275 | 0.006 |
| 0.274 | 0.005 |
| 0.273 | 0.002 |
| 0.272 | 0.005 |
| 0.271 | 0.002 |
| 0.27 | 0.002 |
| 0.269 | 0.008 |
| 0.268 | 0.005 |
| 0.267 | 0.006 |
| 0.266 | 0.005 |
| 0.265 | 0.003 |
| 0.264 | 0.003 |
| 0.263 | 0.007 |
| 0.262 | 0.003 |
| 0.261 | 0.006 |
| 0.26 | 0.006 |
| 0.259 | 0.002 |
| 0.258 | 0.002 |
| 0.257 | 0.007 |
| 0.256 | 0.005 |
| 0.255 | 0.006 |
| 0.254 | 0.006 |
| 0.253 | 0.003 |
| 0.252 | 0.003 |
| 0.251 | 0.008 |
| 0.25 | 0.006 |
| 0.249 | 0.006 |
| 0.248 | 0.004 |
| 0.247 | 0.003 |
| 0.246 | 0.002 |
| 0.245 | 0.007 |
| 0.244 | 0.006 |
| 0.243 | 0.007 |
| 0.242 | 0.004 |
| 0.241 | 0.003 |
| 0.24 | 0.004 |
| 0.239 | 0.008 |
| 0.238 | 0.004 |
| 0.237 | 0.006 |
| 0.236 | 0.005 |
| 0.235 | 0.002 |
| 0.234 | 0.003 |
| 0.233 | 0.007 |
| 0.232 | 0.005 |
| 0.231 | 0.004 |
| 0.23 | 0.005 |
| 0.229 | 0.003 |
| 0.228 | 0.003 |
| 0.227 | 0.007 |
| 0.226 | 0.005 |
| 0.225 | 0.007 |
| 0.224 | 0.006 |
| 0.223 | 0.003 |
| 0.222 | 0.005 |
| 0.221 | 0.008 |
| 0.22 | 0.005 |
| 0.219 | 0.006 |
| 0.218 | 0.007 |
| 0.217 | 0.003 |
| 0.216 | 0.004 |
| 0.215 | 0.007 |
| 0.214 | 0.007 |
| 0.213 | 0.005 |
| 0.212 | 0.007 |
| 0.211 | 0.004 |
| 0.21 | 0.005 |
| 0.209 | 0.007 |
| 0.208 | 0.007 |
| 0.207 | 0.007 |
| 0.206 | 0.006 |
| 0.205 | 0.004 |
| 0.204 | 0.006 |
| 0.203 | 0.007 |
| 0.202 | 0.009 |
| 0.201 | 0.007 |
| 0.2 | 0.01 |